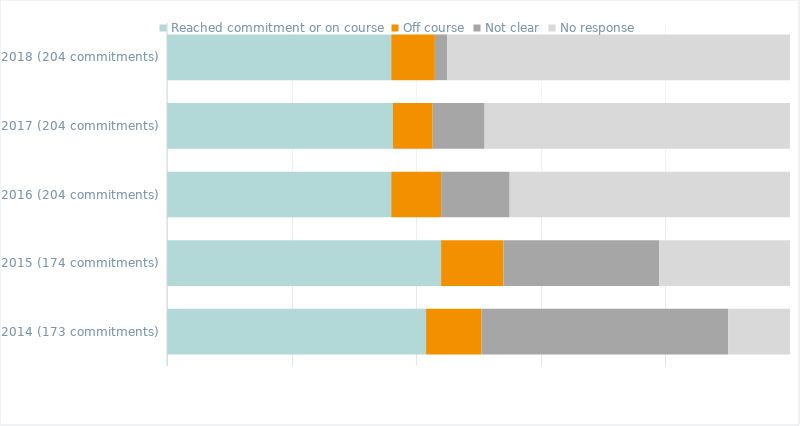
| Category | Reached commitment or on course | Off course | Not clear | No response |
|---|---|---|---|---|
| 2014 (173 commitments) | 0.42 | 0.09 | 0.4 | 0.1 |
| 2015 (174 commitments) | 0.44 | 0.1 | 0.25 | 0.21 |
| 2016 (204 commitments) | 0.36 | 0.08 | 0.11 | 0.45 |
| 2017 (204 commitments) | 0.363 | 0.064 | 0.083 | 0.49 |
| 2018 (204 commitments) | 0.36 | 0.07 | 0.02 | 0.55 |